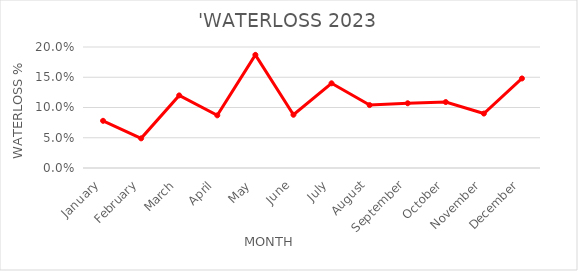
| Category | Series 0 |
|---|---|
| January | 0.078 |
| February | 0.049 |
| March | 0.12 |
| April | 0.087 |
| May | 0.187 |
| June | 0.088 |
| July | 0.14 |
| August | 0.104 |
| September | 0.107 |
| October | 0.109 |
| November | 0.09 |
| December | 0.148 |